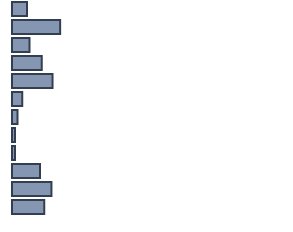
| Category | Series 0 |
|---|---|
| 0 | 5.5 |
| 1 | 17.7 |
| 2 | 6.4 |
| 3 | 10.9 |
| 4 | 14.9 |
| 5 | 3.8 |
| 6 | 2 |
| 7 | 1.1 |
| 8 | 1.1 |
| 9 | 10.3 |
| 10 | 14.5 |
| 11 | 11.9 |